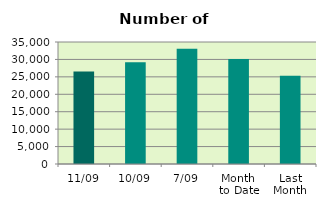
| Category | Series 0 |
|---|---|
| 11/09 | 26562 |
| 10/09 | 29182 |
| 7/09 | 33098 |
| Month 
to Date | 30152.571 |
| Last
Month | 25327.391 |